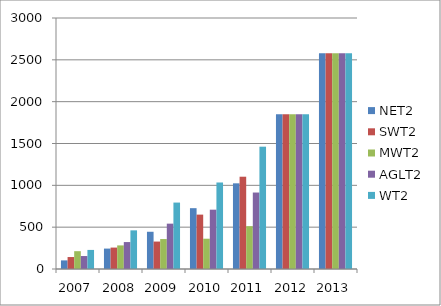
| Category | NET2 | SWT2 | MWT2 | AGLT2 | WT2 |
|---|---|---|---|---|---|
| 2007.0 | 103 | 143 | 213 | 155 | 228 |
| 2008.0 | 244 | 256 | 282 | 322 | 462 |
| 2009.0 | 445 | 328 | 358 | 542 | 794 |
| 2010.0 | 727 | 650 | 362 | 709 | 1034 |
| 2011.0 | 1024 | 1103 | 512 | 914 | 1462 |
| 2012.0 | 1851 | 1851 | 1851 | 1851 | 1851 |
| 2013.0 | 2577.6 | 2577.6 | 2577.6 | 2577.6 | 2577.6 |